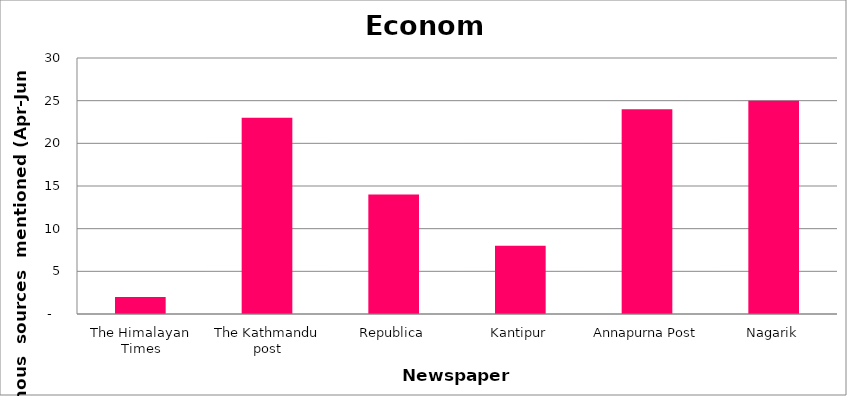
| Category | Economy |
|---|---|
| The Himalayan Times | 2 |
| The Kathmandu post | 23 |
| Republica | 14 |
| Kantipur | 8 |
| Annapurna Post | 24 |
| Nagarik | 25 |